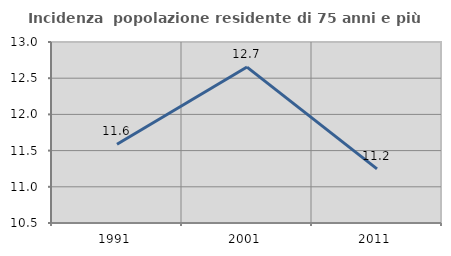
| Category | Incidenza  popolazione residente di 75 anni e più |
|---|---|
| 1991.0 | 11.587 |
| 2001.0 | 12.654 |
| 2011.0 | 11.248 |